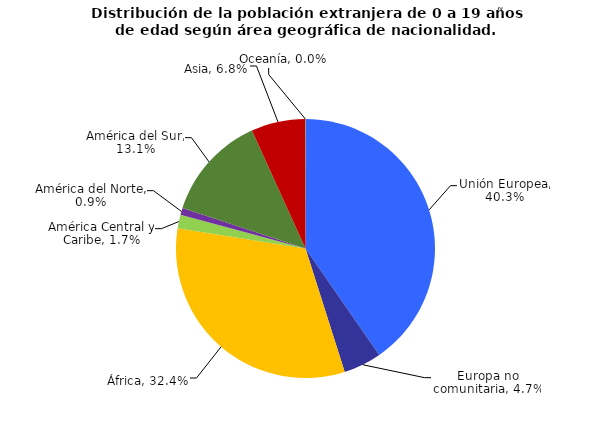
| Category | Series 0 |
|---|---|
| Unión Europea | 0.403 |
| Europa no comunitaria | 0.047 |
| África | 0.324 |
| América Central y Caribe | 0.017 |
| América del Norte | 0.009 |
| América del Sur | 0.131 |
| Asia | 0.068 |
| Oceanía | 0 |